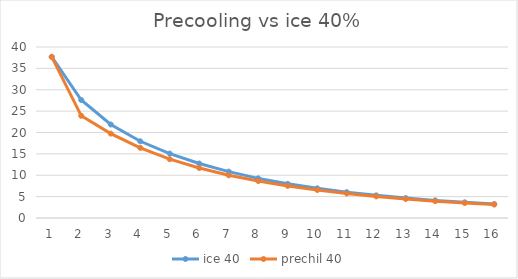
| Category | ice 40 | prechil 40 |
|---|---|---|
| 0 | 37.7 | 37.7 |
| 1 | 27.596 | 23.906 |
| 2 | 21.876 | 19.739 |
| 3 | 17.949 | 16.412 |
| 4 | 15.075 | 13.755 |
| 5 | 12.749 | 11.684 |
| 6 | 10.853 | 9.993 |
| 7 | 9.273 | 8.635 |
| 8 | 7.99 | 7.507 |
| 9 | 6.941 | 6.555 |
| 10 | 6.048 | 5.738 |
| 11 | 5.298 | 5.049 |
| 12 | 4.665 | 4.447 |
| 13 | 4.121 | 3.944 |
| 14 | 3.665 | 3.514 |
| 15 | 3.272 | 3.142 |